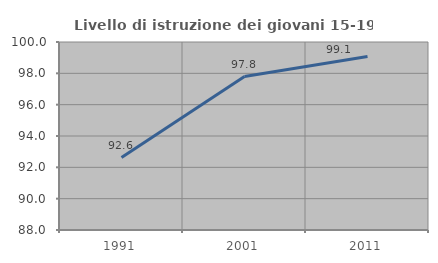
| Category | Livello di istruzione dei giovani 15-19 anni |
|---|---|
| 1991.0 | 92.623 |
| 2001.0 | 97.796 |
| 2011.0 | 99.07 |